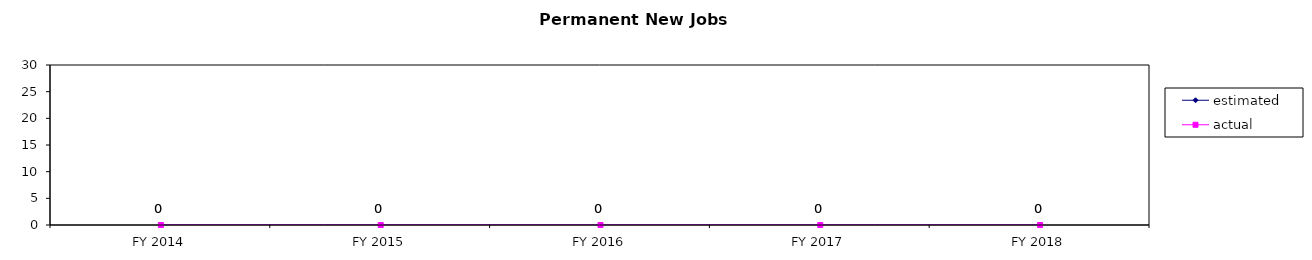
| Category | estimated | actual |
|---|---|---|
| FY 2014 | 0 | 0 |
| FY 2015 | 0 | 0 |
| FY 2016 | 0 | 0 |
| FY 2017 | 0 | 0 |
| FY 2018 | 0 | 0 |